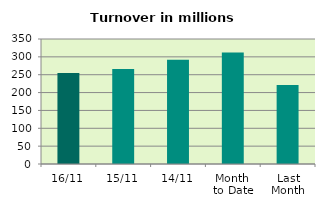
| Category | Series 0 |
|---|---|
| 16/11 | 254.523 |
| 15/11 | 266.031 |
| 14/11 | 291.828 |
| Month 
to Date | 312.413 |
| Last
Month | 221.516 |